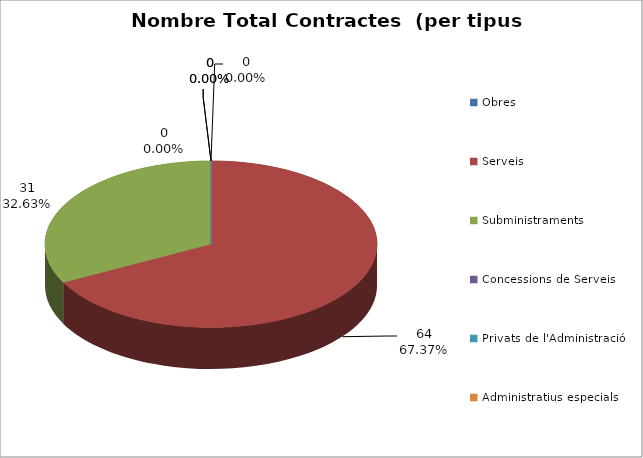
| Category | Nombre Total Contractes |
|---|---|
| Obres | 0 |
| Serveis | 64 |
| Subministraments | 31 |
| Concessions de Serveis | 0 |
| Privats de l'Administració | 0 |
| Administratius especials | 0 |